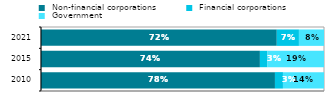
| Category |  Non-financial corporations |  Financial corporations |  Government |
|---|---|---|---|
| 2010.0 | 0.779 | 0.027 | 0.137 |
| 2015.0 | 0.736 | 0.026 | 0.19 |
| 2021.0 | 0.718 | 0.067 | 0.076 |